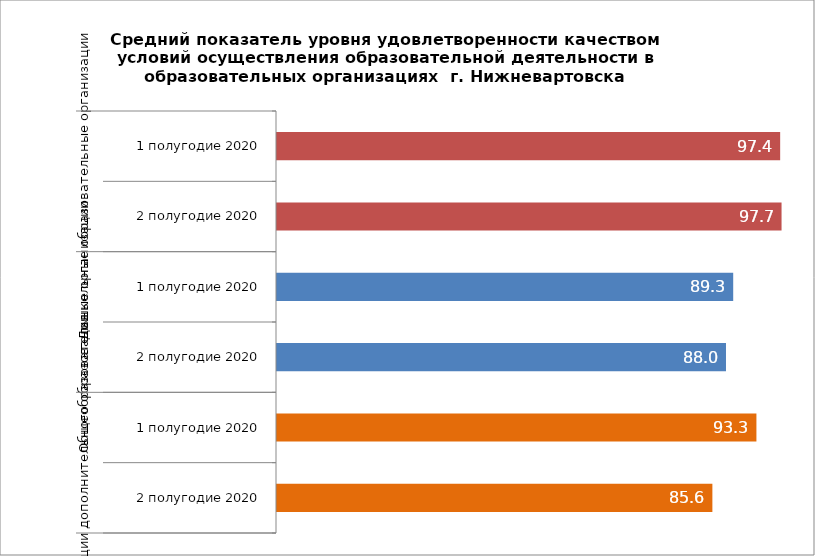
| Category | Series 0 |
|---|---|
| 0 | 97.422 |
| 1 | 97.664 |
| 2 | 89.263 |
| 3 | 88.01 |
| 4 | 93.297 |
| 5 | 85.645 |